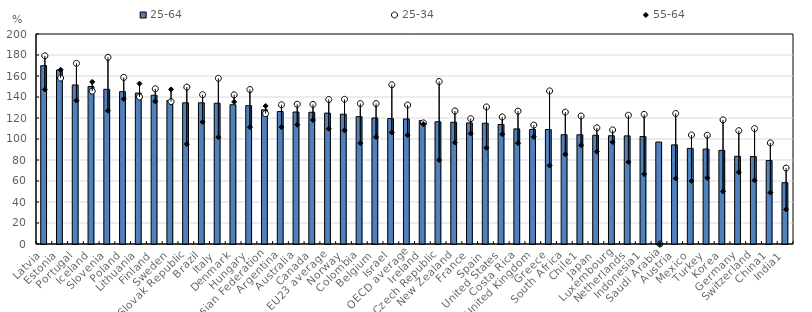
| Category | 25-64 |
|---|---|
| Latvia | 169.856 |
| Estonia | 165.741 |
| Portugal | 151.474 |
| Iceland | 149.928 |
| Slovenia | 147.333 |
| Poland | 145.102 |
| Lithuania | 143.726 |
| Finland | 141.656 |
| Sweden | 136.632 |
| Slovak Republic | 134.466 |
| Brazil | 134.459 |
| Italy | 134.079 |
| Denmark | 132.623 |
| Hungary | 131.743 |
| Russian Federation | 127.827 |
| Argentina | 126.148 |
| Australia | 125.705 |
| Canada | 125.49 |
| EU23 average | 124.666 |
| Norway | 123.634 |
| Colombia | 121.287 |
| Belgium | 119.986 |
| Israel | 119.448 |
| OECD average | 119.108 |
| Ireland | 117.51 |
| Czech Republic | 116.403 |
| New Zealand | 115.962 |
| France | 115.292 |
| Spain | 115.029 |
| United States | 113.816 |
| Costa Rica | 109.614 |
| United Kingdom | 109.098 |
| Greece | 109.087 |
| South Africa | 104.13 |
| Chile1 | 104.018 |
| Japan | 103.552 |
| Luxembourg | 103.131 |
| Netherlands | 102.97 |
| Indonesia1 | 102.314 |
| Saudi Arabia | 97.103 |
| Austria | 94.392 |
| Mexico | 91.047 |
| Turkey | 90.434 |
| Korea | 89.186 |
| Germany | 83.537 |
| Switzerland | 83.339 |
| China1 | 79.578 |
| India1 | 58.374 |